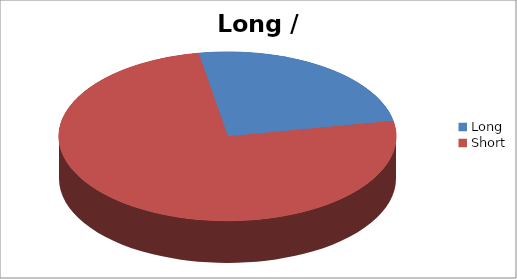
| Category | Series 1 |
|---|---|
| Long | 31 |
| Short | 94 |